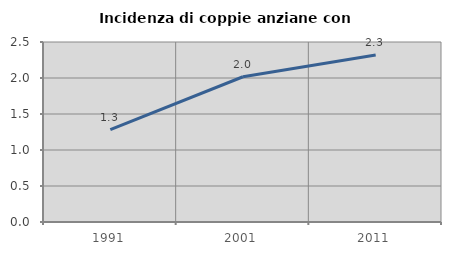
| Category | Incidenza di coppie anziane con figli |
|---|---|
| 1991.0 | 1.283 |
| 2001.0 | 2.017 |
| 2011.0 | 2.321 |